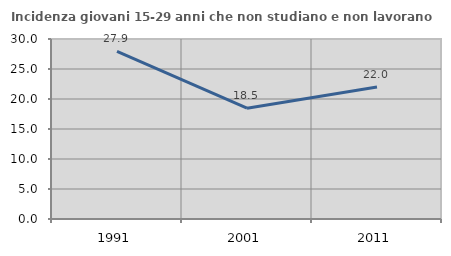
| Category | Incidenza giovani 15-29 anni che non studiano e non lavorano  |
|---|---|
| 1991.0 | 27.941 |
| 2001.0 | 18.462 |
| 2011.0 | 22 |